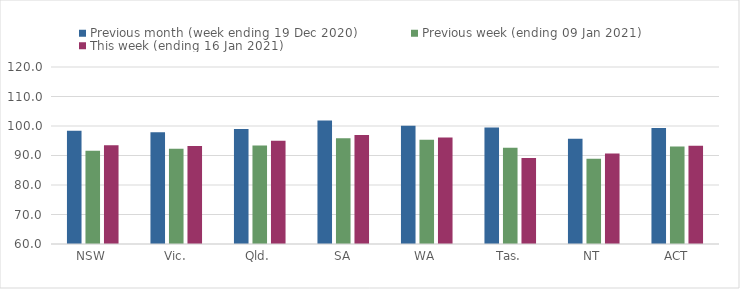
| Category | Previous month (week ending 19 Dec 2020) | Previous week (ending 09 Jan 2021) | This week (ending 16 Jan 2021) |
|---|---|---|---|
| NSW | 98.43 | 91.62 | 93.51 |
| Vic. | 97.85 | 92.31 | 93.22 |
| Qld. | 98.95 | 93.42 | 94.99 |
| SA | 101.88 | 95.85 | 96.94 |
| WA | 100.09 | 95.32 | 96.08 |
| Tas. | 99.48 | 92.64 | 89.16 |
| NT | 95.68 | 88.94 | 90.72 |
| ACT | 99.33 | 93.08 | 93.28 |